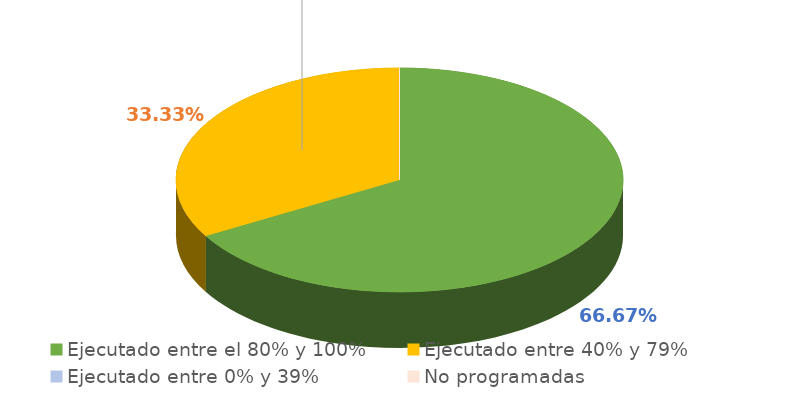
| Category | Series 0 |
|---|---|
| Ejecutado entre el 80% y 100% | 0.667 |
| Ejecutado entre 40% y 79% | 0.333 |
| Ejecutado entre 0% y 39% | 0 |
| No programadas | 0 |